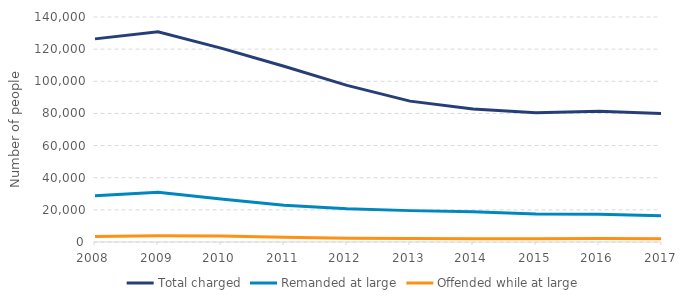
| Category | Total charged | Remanded at large | Offended while at large |
|---|---|---|---|
| 2008.0 | 126393 | 28837 | 3377 |
| 2009.0 | 130848 | 30989 | 3927 |
| 2010.0 | 120637 | 26824 | 3668 |
| 2011.0 | 109369 | 22924 | 2901 |
| 2012.0 | 97432 | 20725 | 2407 |
| 2013.0 | 87657 | 19522 | 2185 |
| 2014.0 | 82687 | 18771 | 2025 |
| 2015.0 | 80388 | 17350 | 2038 |
| 2016.0 | 81316 | 17332 | 2214 |
| 2017.0 | 79986 | 16324 | 2015 |